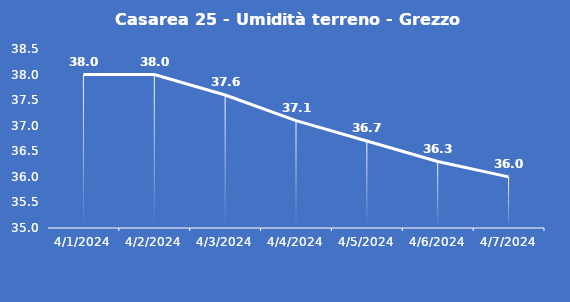
| Category | Casarea 25 - Umidità terreno - Grezzo (%VWC) |
|---|---|
| 4/1/24 | 38 |
| 4/2/24 | 38 |
| 4/3/24 | 37.6 |
| 4/4/24 | 37.1 |
| 4/5/24 | 36.7 |
| 4/6/24 | 36.3 |
| 4/7/24 | 36 |